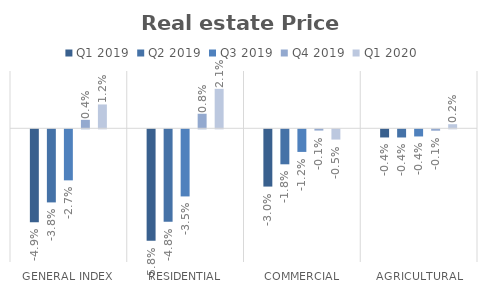
| Category | Q1 2019 | Q2 2019 | Q3 2019 | Q4 2019 | Q1 2020 |
|---|---|---|---|---|---|
| General Index | -0.049 | -0.038 | -0.027 | 0.004 | 0.012 |
| Residential | -0.058 | -0.048 | -0.035 | 0.008 | 0.021 |
| Commercial | -0.03 | -0.018 | -0.012 | -0.001 | -0.005 |
| Agricultural | -0.004 | -0.004 | -0.004 | -0.001 | 0.002 |